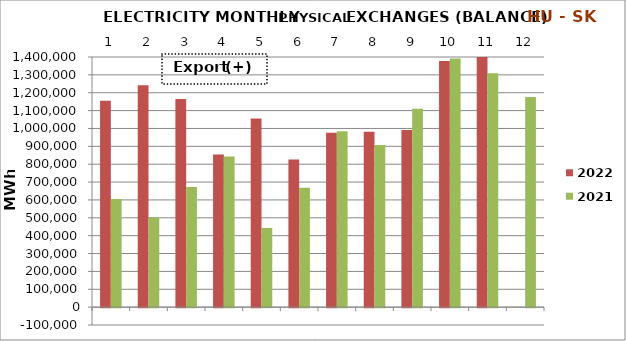
| Category | 2022 | 2021 |
|---|---|---|
| 0 | 1154593.08 | 605396.322 |
| 1 | 1241919.946 | 502817.058 |
| 2 | 1165323.234 | 671978.265 |
| 3 | 854022.263 | 842403.002 |
| 4 | 1055166.712 | 443421.422 |
| 5 | 826082.203 | 667716.722 |
| 6 | 976087.861 | 984257.38 |
| 7 | 981687.692 | 907186.703 |
| 8 | 991996.086 | 1110898.241 |
| 9 | 1378302.754 | 1392279.848 |
| 10 | 1405605.898 | 1309247.205 |
| 11 | 0 | 1175627.019 |